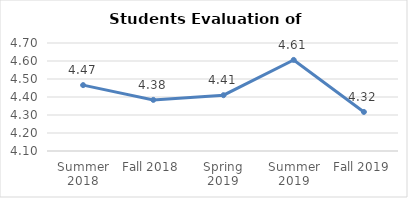
| Category | Series 0 |
|---|---|
| Summer 2018 | 4.466 |
| Fall 2018 | 4.384 |
| Spring 2019 | 4.41 |
| Summer 2019 | 4.606 |
| Fall 2019 | 4.317 |